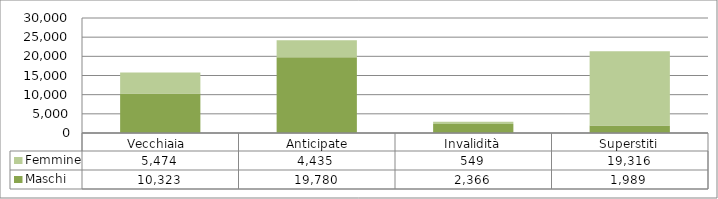
| Category | Maschi | Femmine |
|---|---|---|
| Vecchiaia  | 10323 | 5474 |
|  Anticipate | 19780 | 4435 |
| Invalidità | 2366 | 549 |
| Superstiti | 1989 | 19316 |